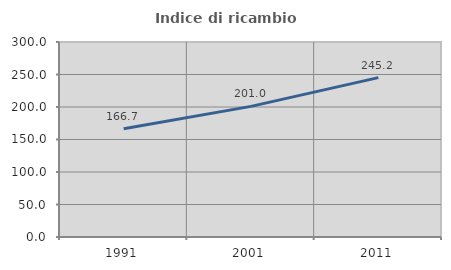
| Category | Indice di ricambio occupazionale  |
|---|---|
| 1991.0 | 166.667 |
| 2001.0 | 200.962 |
| 2011.0 | 245.161 |